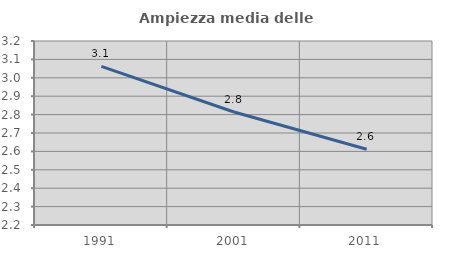
| Category | Ampiezza media delle famiglie |
|---|---|
| 1991.0 | 3.062 |
| 2001.0 | 2.814 |
| 2011.0 | 2.611 |